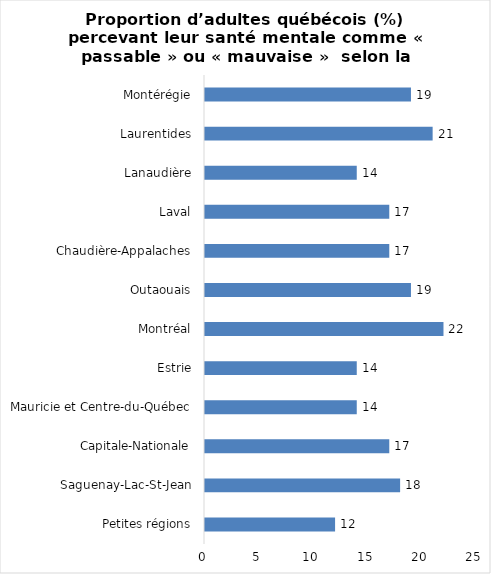
| Category | Series 0 |
|---|---|
| Petites régions | 12 |
| Saguenay-Lac-St-Jean | 18 |
| Capitale-Nationale | 17 |
| Mauricie et Centre-du-Québec | 14 |
| Estrie | 14 |
| Montréal | 22 |
| Outaouais | 19 |
| Chaudière-Appalaches | 17 |
| Laval | 17 |
| Lanaudière | 14 |
| Laurentides | 21 |
| Montérégie | 19 |